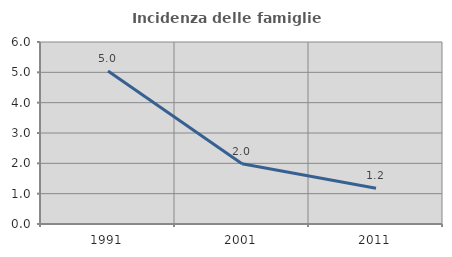
| Category | Incidenza delle famiglie numerose |
|---|---|
| 1991.0 | 5.042 |
| 2001.0 | 1.987 |
| 2011.0 | 1.181 |